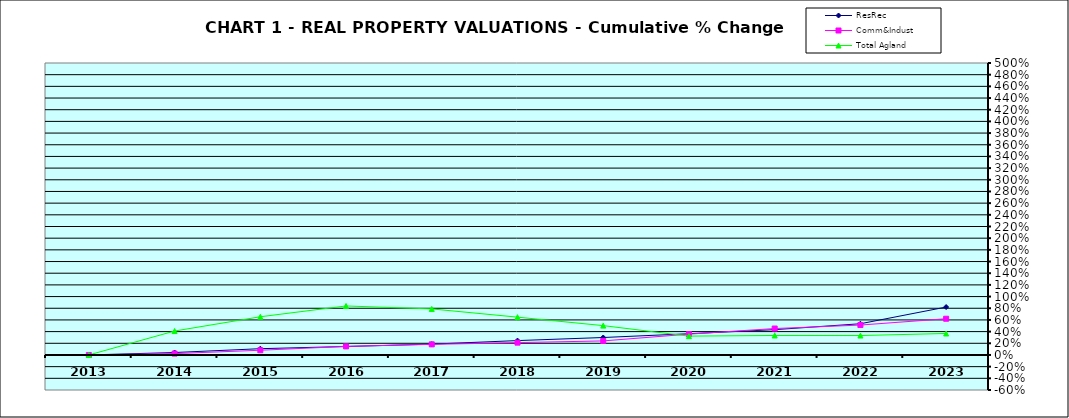
| Category | ResRec | Comm&Indust | Total Agland |
|---|---|---|---|
| 2013.0 | 0 | 0 | 0 |
| 2014.0 | 0.042 | 0.024 | 0.41 |
| 2015.0 | 0.107 | 0.081 | 0.654 |
| 2016.0 | 0.145 | 0.147 | 0.839 |
| 2017.0 | 0.186 | 0.182 | 0.788 |
| 2018.0 | 0.246 | 0.211 | 0.648 |
| 2019.0 | 0.299 | 0.241 | 0.502 |
| 2020.0 | 0.364 | 0.357 | 0.323 |
| 2021.0 | 0.433 | 0.453 | 0.334 |
| 2022.0 | 0.535 | 0.512 | 0.333 |
| 2023.0 | 0.82 | 0.62 | 0.368 |